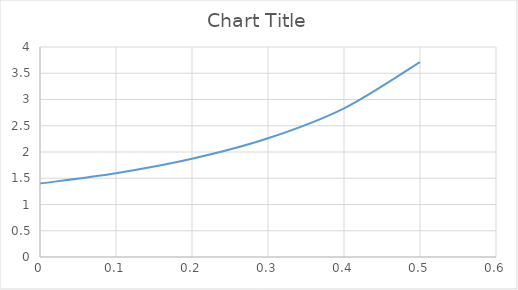
| Category | Series 0 |
|---|---|
| 0.0 | 1.4 |
| 0.1 | 1.596 |
| 0.2 | 1.871 |
| 0.30000000000000004 | 2.261 |
| 0.4 | 2.832 |
| 0.5 | 3.714 |